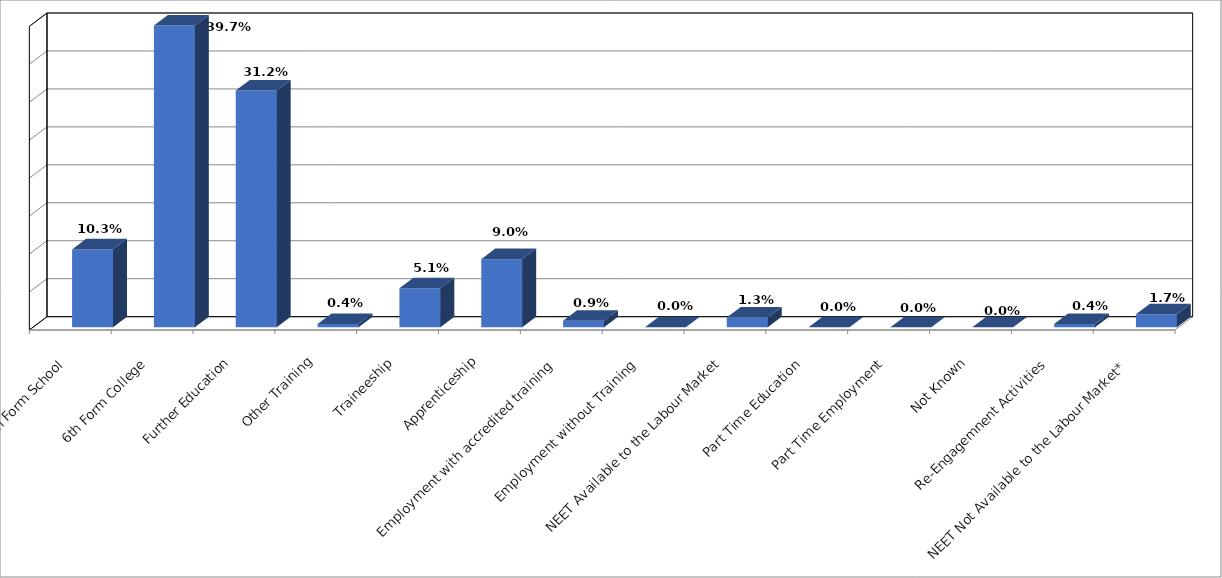
| Category | Series 0 | Series 1 |
|---|---|---|
| 6th Form School |  | 0.103 |
| 6th Form College |  | 0.397 |
| Further Education |  | 0.312 |
| Other Training |  | 0.004 |
| Traineeship |  | 0.051 |
| Apprenticeship |  | 0.09 |
| Employment with accredited training |  | 0.009 |
| Employment without Training |  | 0 |
| NEET Available to the Labour Market |  | 0.013 |
| Part Time Education |  | 0 |
| Part Time Employment |  | 0 |
| Not Known |  | 0 |
| Re-Engagemnent Activities |  | 0.004 |
| NEET Not Available to the Labour Market* |  | 0.017 |